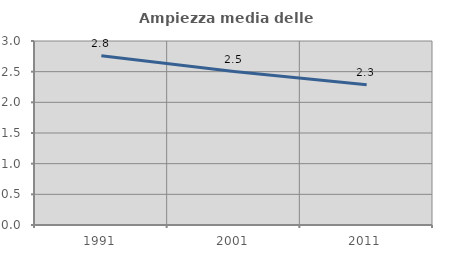
| Category | Ampiezza media delle famiglie |
|---|---|
| 1991.0 | 2.758 |
| 2001.0 | 2.501 |
| 2011.0 | 2.285 |